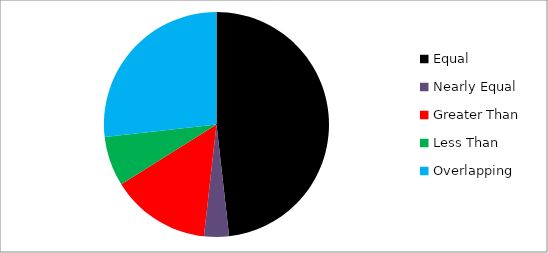
| Category | Series 0 |
|---|---|
| Equal | 27 |
| Nearly Equal | 2 |
| Greater Than | 8 |
| Less Than | 4 |
| Overlapping | 15 |